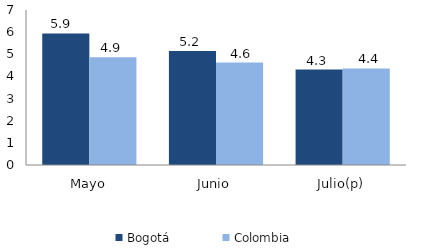
| Category | Bogotá | Colombia |
|---|---|---|
| Mayo | 5.943 | 4.871 |
| Junio | 5.151 | 4.623 |
| Julio(p) | 4.311 | 4.36 |